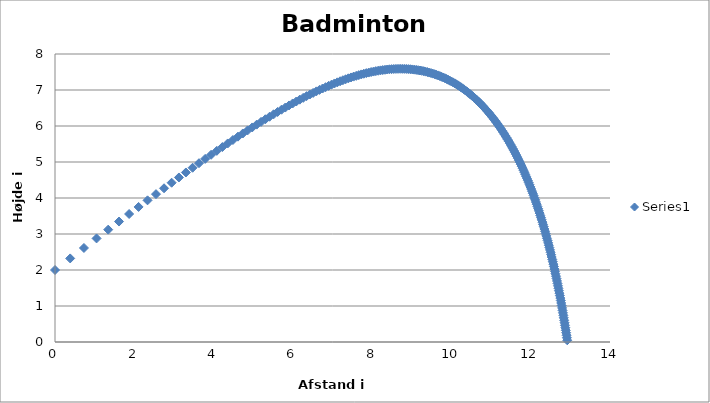
| Category | Series 0 |
|---|---|
| 0.0 | 2 |
| 0.383 | 2.321 |
| 0.7303819289556337 | 2.612 |
| 1.0485032770308464 | 2.877 |
| 1.3421230162270148 | 3.121 |
| 1.6149043055200287 | 3.346 |
| 1.869731808538568 | 3.556 |
| 2.1089207046249703 | 3.751 |
| 2.334359268925929 | 3.935 |
| 2.5476090354562295 | 4.108 |
| 2.749976945095246 | 4.27 |
| 2.9425684485368944 | 4.424 |
| 3.1263273347693445 | 4.57 |
| 3.3020661030098193 | 4.709 |
| 3.4704894669425475 | 4.841 |
| 3.632212785235098 | 4.966 |
| 3.7877766857688853 | 5.086 |
| 3.9376587946876236 | 5.2 |
| 4.082283235544745 | 5.31 |
| 4.222028391276315 | 5.415 |
| 4.357233298677975 | 5.515 |
| 4.488202956048464 | 5.611 |
| 4.615212759411918 | 5.704 |
| 4.738512234318112 | 5.793 |
| 4.858328193895328 | 5.878 |
| 4.974867426292207 | 5.96 |
| 5.088318993565692 | 6.038 |
| 5.198856207791791 | 6.114 |
| 5.3066383374960555 | 6.187 |
| 5.411812087547551 | 6.257 |
| 5.5145128877895795 | 6.325 |
| 5.6148660194136495 | 6.39 |
| 5.71298760306077 | 6.452 |
| 5.808985468584239 | 6.512 |
| 5.902959923123348 | 6.57 |
| 5.995004431458655 | 6.626 |
| 6.085206220423407 | 6.68 |
| 6.173646817336511 | 6.732 |
| 6.260402530924937 | 6.781 |
| 6.345544881958316 | 6.829 |
| 6.429140989778886 | 6.875 |
| 6.5112539200383175 | 6.919 |
| 6.5919429982193565 | 6.962 |
| 6.671264092900534 | 7.002 |
| 6.749269872196816 | 7.041 |
| 6.826010036362162 | 7.079 |
| 6.901531529158595 | 7.115 |
| 6.975878730269853 | 7.149 |
| 7.049093630757412 | 7.182 |
| 7.12121599331519 | 7.213 |
| 7.192283498870904 | 7.243 |
| 7.262331880901509 | 7.271 |
| 7.331395048673589 | 7.298 |
| 7.399505200483283 | 7.324 |
| 7.466692927851465 | 7.349 |
| 7.532987311526064 | 7.372 |
| 7.598416010052376 | 7.394 |
| 7.66300534159237 | 7.414 |
| 7.726780359603697 | 7.433 |
| 7.789764922927208 | 7.452 |
| 7.851981760777057 | 7.468 |
| 7.913452533079083 | 7.484 |
| 7.974197886560254 | 7.499 |
| 8.034237506953824 | 7.512 |
| 8.093590167650925 | 7.524 |
| 8.152273775099067 | 7.535 |
| 8.210305411220947 | 7.545 |
| 8.267701373102767 | 7.554 |
| 8.324477210179472 | 7.562 |
| 8.38064775912476 | 7.569 |
| 8.436227176636043 | 7.575 |
| 8.491228970288528 | 7.58 |
| 8.545666027618063 | 7.583 |
| 8.599550643579201 | 7.586 |
| 8.6528945465128 | 7.587 |
| 8.705708922746435 | 7.588 |
| 8.758004439940711 | 7.588 |
| 8.809791269285085 | 7.586 |
| 8.861079106638183 | 7.584 |
| 8.911877192699414 | 7.581 |
| 8.96219433229117 | 7.577 |
| 9.012038912823837 | 7.572 |
| 9.061418922009224 | 7.565 |
| 9.110341964881865 | 7.558 |
| 9.158815280181786 | 7.551 |
| 9.206845756146949 | 7.542 |
| 9.254439945758437 | 7.532 |
| 9.301604081476707 | 7.521 |
| 9.348344089502778 | 7.51 |
| 9.394665603594069 | 7.497 |
| 9.440573978460833 | 7.484 |
| 9.48607430276553 | 7.47 |
| 9.531171411744339 | 7.455 |
| 9.57586989946702 | 7.439 |
| 9.620174130748762 | 7.423 |
| 9.664088252725223 | 7.405 |
| 9.707616206100015 | 7.387 |
| 9.750761736071942 | 7.367 |
| 9.79352840294788 | 7.348 |
| 9.835919592445803 | 7.327 |
| 9.877938525691441 | 7.305 |
| 9.919588268911161 | 7.283 |
| 9.960871742823057 | 7.26 |
| 10.001791731727721 | 7.236 |
| 10.042350892299867 | 7.211 |
| 10.082551762081843 | 7.185 |
| 10.122396767680009 | 7.159 |
| 10.161888232665012 | 7.132 |
| 10.201028385177215 | 7.105 |
| 10.239819365238718 | 7.076 |
| 10.278263231773739 | 7.047 |
| 10.316361969339477 | 7.017 |
| 10.35411749456994 | 6.986 |
| 10.391531662335629 | 6.955 |
| 10.4286062716224 | 6.923 |
| 10.465343071133198 | 6.89 |
| 10.501743764616808 | 6.857 |
| 10.537810015928134 | 6.823 |
| 10.573543453824893 | 6.788 |
| 10.608945676505991 | 6.753 |
| 10.644018255897127 | 6.717 |
| 10.67876274168952 | 6.68 |
| 10.713180665137878 | 6.643 |
| 10.747273542624006 | 6.605 |
| 10.781042878992606 | 6.566 |
| 10.814490170666051 | 6.527 |
| 10.847616908545014 | 6.487 |
| 10.880424580701964 | 6.447 |
| 10.91291467487463 | 6.406 |
| 10.945088680766577 | 6.364 |
| 10.976948092162084 | 6.322 |
| 11.008494408862502 | 6.279 |
| 11.039729138451273 | 6.236 |
| 11.070653797894746 | 6.192 |
| 11.10126991498586 | 6.148 |
| 11.131579029637704 | 6.103 |
| 11.16158269503387 | 6.057 |
| 11.191282478642405 | 6.012 |
| 11.220679963100062 | 5.965 |
| 11.249776746973408 | 5.918 |
| 11.27857444540321 | 5.871 |
| 11.3070746906384 | 5.823 |
| 11.335279132465717 | 5.774 |
| 11.363189438541008 | 5.725 |
| 11.390807294627985 | 5.676 |
| 11.418134404750049 | 5.626 |
| 11.445172491260665 | 5.576 |
| 11.471923294837536 | 5.525 |
| 11.498388574405698 | 5.474 |
| 11.524570106994451 | 5.422 |
| 11.550469687532873 | 5.37 |
| 11.576089128588475 | 5.317 |
| 11.601430260053398 | 5.265 |
| 11.626494928782348 | 5.211 |
| 11.651284998186316 | 5.158 |
| 11.675802347785947 | 5.103 |
| 11.700048872728237 | 5.049 |
| 11.724026483270118 | 4.994 |
| 11.747737104232247 | 4.939 |
| 11.771182674426244 | 4.883 |
| 11.794365146058393 | 4.827 |
| 11.817286484112707 | 4.771 |
| 11.839948665716108 | 4.714 |
| 11.86235367948829 | 4.657 |
| 11.884503524878742 | 4.6 |
| 11.906400211493228 | 4.542 |
| 11.92804575841192 | 4.485 |
| 11.949442193501222 | 4.426 |
| 11.97059155272121 | 4.368 |
| 11.991495879430513 | 4.309 |
| 12.012157223690302 | 4.25 |
| 12.032577641568968 | 4.19 |
| 12.052759194448978 | 4.13 |
| 12.072703948337232 | 4.07 |
| 12.092413973180241 | 4.01 |
| 12.111891342185249 | 3.949 |
| 12.131138131148397 | 3.889 |
| 12.15015641779093 | 3.827 |
| 12.16894828110433 | 3.766 |
| 12.187515800705231 | 3.704 |
| 12.205861056200847 | 3.643 |
| 12.223986126565604 | 3.58 |
| 12.241893089529583 | 3.518 |
| 12.259584020979327 | 3.456 |
| 12.277060994371485 | 3.393 |
| 12.29432608015974 | 3.33 |
| 12.311381345235363 | 3.266 |
| 12.328228852381743 | 3.203 |
| 12.344870659743142 | 3.139 |
| 12.361308820307903 | 3.076 |
| 12.377545381406296 | 3.011 |
| 12.39358238422315 | 2.947 |
| 12.409421863325338 | 2.883 |
| 12.425065846204227 | 2.818 |
| 12.440516352833084 | 2.753 |
| 12.455775395239474 | 2.688 |
| 12.47084497709259 | 2.623 |
| 12.485727093305488 | 2.558 |
| 12.50042372965213 | 2.492 |
| 12.514936862399136 | 2.427 |
| 12.52926845795213 | 2.361 |
| 12.543420472516528 | 2.295 |
| 12.557394851772615 | 2.229 |
| 12.571193530564726 | 2.162 |
| 12.584818432604347 | 2.096 |
| 12.598271470186935 | 2.029 |
| 12.611554543922228 | 1.963 |
| 12.624669542477834 | 1.896 |
| 12.63761834233585 | 1.829 |
| 12.650402807562275 | 1.762 |
| 12.663024789588961 | 1.695 |
| 12.675486127007852 | 1.627 |
| 12.687788645377232 | 1.56 |
| 12.699934157039731 | 1.492 |
| 12.711924460951812 | 1.424 |
| 12.723761342524462 | 1.356 |
| 12.735446573474817 | 1.288 |
| 12.746981911688438 | 1.22 |
| 12.75836910109196 | 1.152 |
| 12.769609871535847 | 1.084 |
| 12.780705938686957 | 1.015 |
| 12.791659003930654 | 0.947 |
| 12.802470754282183 | 0.878 |
| 12.813142862307036 | 0.81 |
| 12.823676986050044 | 0.741 |
| 12.834074768972913 | 0.672 |
| 12.84433783989994 | 0.603 |
| 12.854467812971654 | 0.534 |
| 12.864466287606113 | 0.465 |
| 12.874334848467603 | 0.396 |
| 12.884075065442481 | 0.326 |
| 12.893688493621918 | 0.257 |
| 12.903176673291298 | 0.188 |
| 12.912541129926032 | 0.118 |
| 12.92178337419353 | 0.048 |